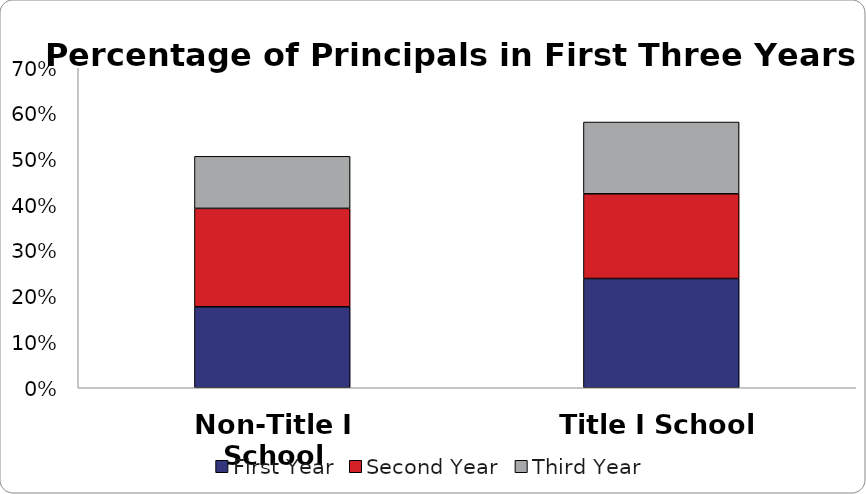
| Category | First Year | Second Year | Third Year |
|---|---|---|---|
| Non-Title I School | 0.177 | 0.215 | 0.114 |
| Title I School | 0.239 | 0.185 | 0.157 |